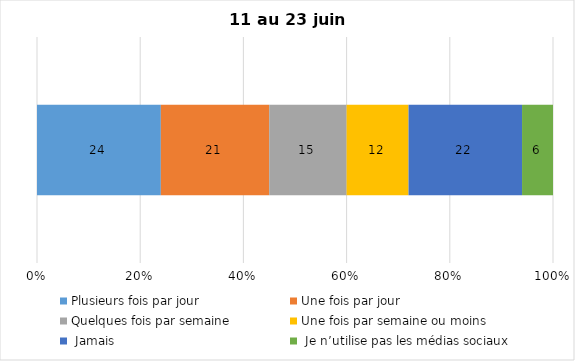
| Category | Plusieurs fois par jour | Une fois par jour | Quelques fois par semaine   | Une fois par semaine ou moins   |  Jamais   |  Je n’utilise pas les médias sociaux |
|---|---|---|---|---|---|---|
| 0 | 24 | 21 | 15 | 12 | 22 | 6 |